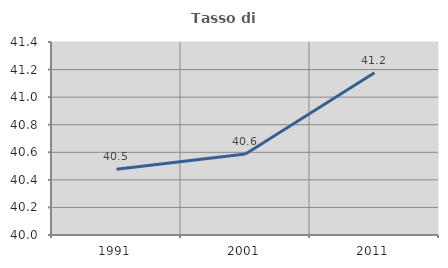
| Category | Tasso di occupazione   |
|---|---|
| 1991.0 | 40.477 |
| 2001.0 | 40.588 |
| 2011.0 | 41.176 |